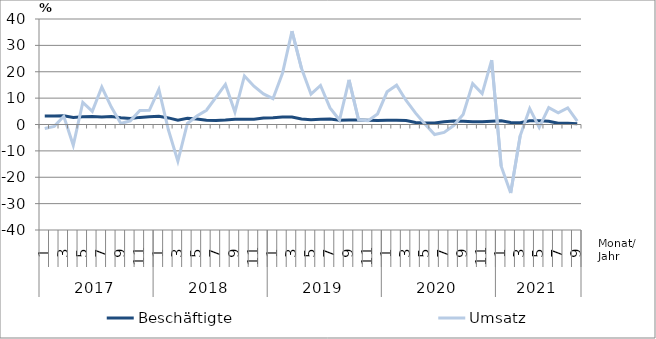
| Category | Beschäftigte | Umsatz |
|---|---|---|
| 0 | 3.2 | -1.5 |
| 1 | 3.2 | -0.7 |
| 2 | 3.3 | 3.1 |
| 3 | 2.7 | -7.9 |
| 4 | 2.9 | 8.4 |
| 5 | 3 | 5 |
| 6 | 2.8 | 14.2 |
| 7 | 3 | 6.6 |
| 8 | 2.6 | 0.4 |
| 9 | 2.3 | 1.4 |
| 10 | 2.7 | 5.3 |
| 11 | 2.9 | 5.4 |
| 12 | 3.1 | 13.3 |
| 13 | 2.5 | -2 |
| 14 | 1.6 | -13.9 |
| 15 | 2.4 | 0.4 |
| 16 | 2.1 | 3.2 |
| 17 | 1.6 | 5.4 |
| 18 | 1.5 | 10.3 |
| 19 | 1.7 | 15.2 |
| 20 | 2 | 4.7 |
| 21 | 2 | 18.4 |
| 22 | 2 | 14.5 |
| 23 | 2.5 | 11.6 |
| 24 | 2.6 | 9.8 |
| 25 | 2.8 | 19.4 |
| 26 | 2.8 | 35.4 |
| 27 | 2.1 | 21.3 |
| 28 | 1.8 | 11.5 |
| 29 | 2 | 14.8 |
| 30 | 2.1 | 6.3 |
| 31 | 1.6 | 1.7 |
| 32 | 1.7 | 16.9 |
| 33 | 1.7 | 1.8 |
| 34 | 1.6 | 1.4 |
| 35 | 1.5 | 4 |
| 36 | 1.6 | 12.4 |
| 37 | 1.6 | 14.9 |
| 38 | 1.5 | 9.1 |
| 39 | 0.8 | 4.3 |
| 40 | 0.6 | 0.1 |
| 41 | 0.6 | -3.8 |
| 42 | 1 | -3 |
| 43 | 1.3 | -0.4 |
| 44 | 1.2 | 3.8 |
| 45 | 1 | 15.5 |
| 46 | 1 | 11.7 |
| 47 | 1.2 | 24.4 |
| 48 | 1.4 | -15.8 |
| 49 | 0.8 | -26 |
| 50 | 0.7 | -4.3 |
| 51 | 1.4 | 6 |
| 52 | 1.4 | -1.1 |
| 53 | 1.2 | 6.4 |
| 54 | 0.5 | 4.4 |
| 55 | 0.5 | 6.3 |
| 56 | 0.3 | 1.3 |